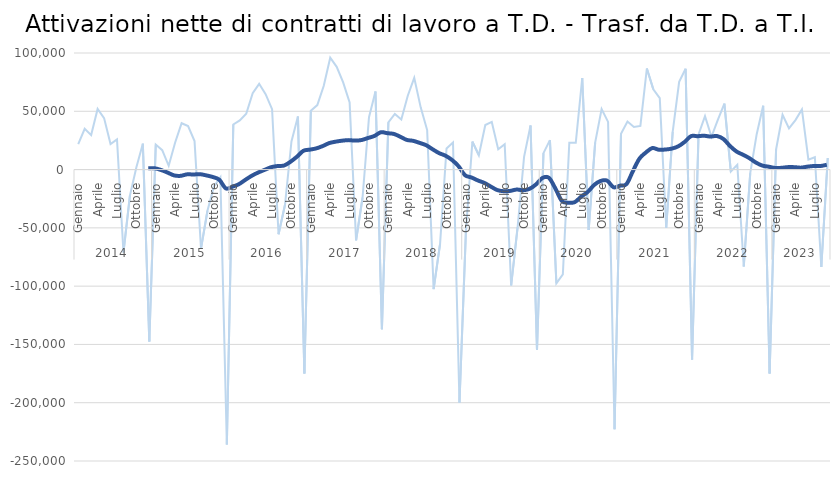
| Category | T.D. - Trasf. da T.D. |
|---|---|
| 0 | 21799 |
| 1 | 34933 |
| 2 | 29572 |
| 3 | 52050 |
| 4 | 44186 |
| 5 | 21844 |
| 6 | 25930 |
| 7 | -71009 |
| 8 | -22361 |
| 9 | 1962 |
| 10 | 22242 |
| 11 | -147527 |
| 12 | 21474 |
| 13 | 16609 |
| 14 | 3239 |
| 15 | 23232 |
| 16 | 39759 |
| 17 | 37298 |
| 18 | 24435 |
| 19 | -67750 |
| 20 | -35346 |
| 21 | -14517 |
| 22 | -6582 |
| 23 | -235856 |
| 24 | 38675 |
| 25 | 42204 |
| 26 | 47855 |
| 27 | 65578 |
| 28 | 73541 |
| 29 | 64639 |
| 30 | 51782 |
| 31 | -55494 |
| 32 | -30245 |
| 33 | 24122 |
| 34 | 45530 |
| 35 | -174981 |
| 36 | 50538 |
| 37 | 55342 |
| 38 | 71903 |
| 39 | 95990 |
| 40 | 88147 |
| 41 | 74784 |
| 42 | 57527 |
| 43 | -60712 |
| 44 | -24178 |
| 45 | 44979 |
| 46 | 66983 |
| 47 | -136949 |
| 48 | 40578 |
| 49 | 47734 |
| 50 | 43014 |
| 51 | 63387 |
| 52 | 78655 |
| 53 | 53365 |
| 54 | 33859 |
| 55 | -102574 |
| 56 | -63653 |
| 57 | 18113 |
| 58 | 23278 |
| 59 | -199951 |
| 60 | -52669 |
| 61 | 24034 |
| 62 | 12261 |
| 63 | 38236 |
| 64 | 40888 |
| 65 | 17333 |
| 66 | 21695 |
| 67 | -99389 |
| 68 | -49381 |
| 69 | 10928 |
| 70 | 37764 |
| 71 | -154688 |
| 72 | 14086 |
| 73 | 25296 |
| 74 | -97549 |
| 75 | -89893 |
| 76 | 23029 |
| 77 | 22992 |
| 78 | 78498 |
| 79 | -51839 |
| 80 | 23146 |
| 81 | 51992 |
| 82 | 40899 |
| 83 | -222826 |
| 84 | 30777 |
| 85 | 41187 |
| 86 | 36540 |
| 87 | 37489 |
| 88 | 86714 |
| 89 | 68931 |
| 90 | 61243 |
| 91 | -49888 |
| 92 | 32388 |
| 93 | 75324 |
| 94 | 86489 |
| 95 | -162992 |
| 96 | 30174 |
| 97 | 45731 |
| 98 | 28122 |
| 99 | 42865 |
| 100 | 56598 |
| 101 | -1691 |
| 102 | 4053 |
| 103 | -83194 |
| 104 | -3122 |
| 105 | 30335 |
| 106 | 54694 |
| 107 | -174887 |
| 108 | 17266 |
| 109 | 47034 |
| 110 | 35267 |
| 111 | 42448 |
| 112 | 51554 |
| 113 | 8571 |
| 114 | 10599 |
| 115 | -83585 |
| 116 | 9945 |